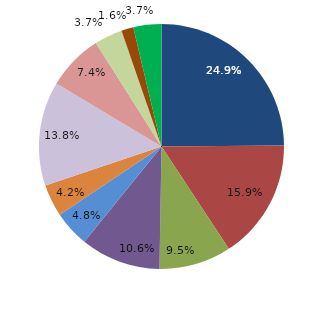
| Category | Series 0 |
|---|---|
| قبل الدخول | 24.868 |
| -1 | 15.873 |
| 1 | 9.524 |
| 2 | 10.582 |
| 3 | 4.762 |
| 4 | 4.233 |
|  5 - 9 | 13.757 |
|  10 - 14 | 7.407 |
|  15 - 19 | 3.704 |
|  20 - 24 | 1.587 |
| 25 + | 3.704 |